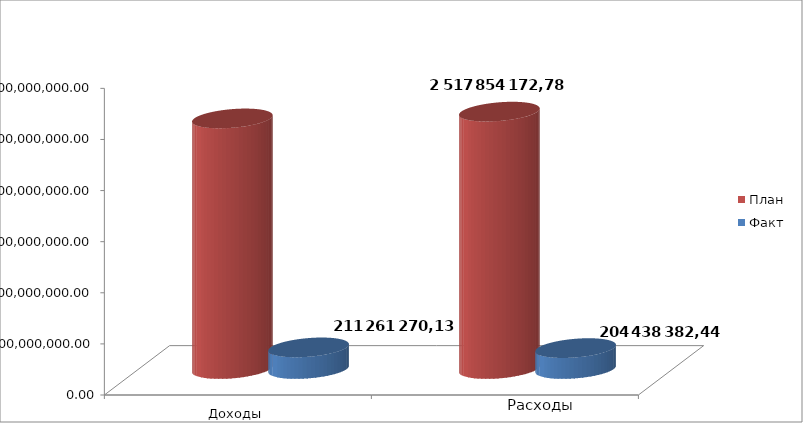
| Category | План | Факт |
|---|---|---|
| 0 | 2451317158.92 | 211261270.13 |
| 1 | 2517854172.78 | 204438382.44 |